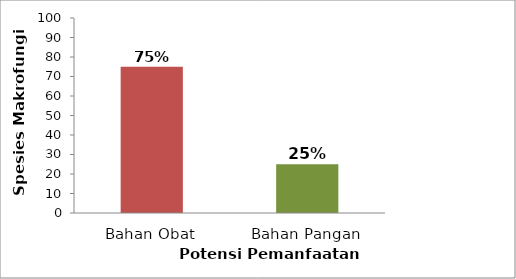
| Category | Potensi Pemanfaatan Makrofungi  Potensi Pemafaatan |
|---|---|
| Bahan Obat | 75 |
| Bahan Pangan | 25 |